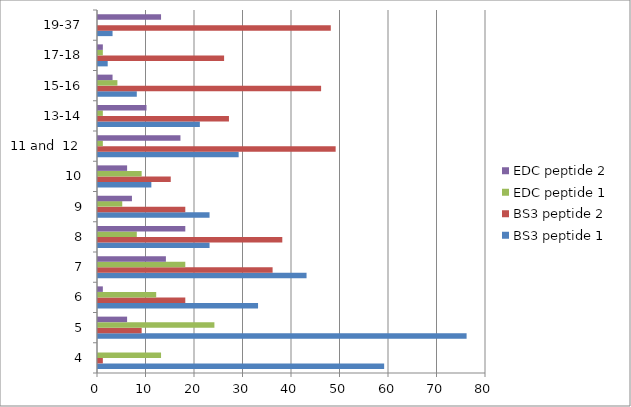
| Category | BS3 peptide 1 | BS3 peptide 2  | EDC peptide 1 | EDC peptide 2  |
|---|---|---|---|---|
| 4 | 59 | 1 | 13 | 0 |
| 5 | 76 | 9 | 24 | 6 |
| 6 | 33 | 18 | 12 | 1 |
| 7 | 43 | 36 | 18 | 14 |
| 8 | 23 | 38 | 8 | 18 |
| 9 | 23 | 18 | 5 | 7 |
| 10 | 11 | 15 | 9 | 6 |
| 11 and  12 | 29 | 49 | 1 | 17 |
| 13-14 | 21 | 27 | 1 | 10 |
| 15-16 | 8 | 46 | 4 | 3 |
| 17-18 | 2 | 26 | 1 | 1 |
| 19-37 | 3 | 48 | 0 | 13 |